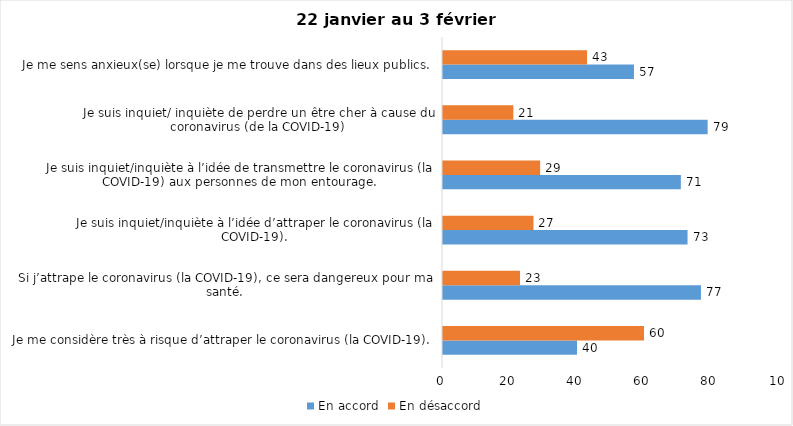
| Category | En accord | En désaccord |
|---|---|---|
| Je me considère très à risque d’attraper le coronavirus (la COVID-19). | 40 | 60 |
| Si j’attrape le coronavirus (la COVID-19), ce sera dangereux pour ma santé. | 77 | 23 |
| Je suis inquiet/inquiète à l’idée d’attraper le coronavirus (la COVID-19). | 73 | 27 |
| Je suis inquiet/inquiète à l’idée de transmettre le coronavirus (la COVID-19) aux personnes de mon entourage. | 71 | 29 |
| Je suis inquiet/ inquiète de perdre un être cher à cause du coronavirus (de la COVID-19) | 79 | 21 |
| Je me sens anxieux(se) lorsque je me trouve dans des lieux publics. | 57 | 43 |